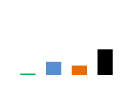
| Category | East |
|---|---|
| Chewbacca | 8377.072 |
| Hansolo | 76801.877 |
| James Kirk | 55269.557 |
| Luke Skywalker | 149843.289 |